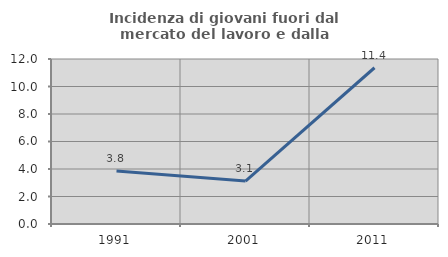
| Category | Incidenza di giovani fuori dal mercato del lavoro e dalla formazione  |
|---|---|
| 1991.0 | 3.846 |
| 2001.0 | 3.125 |
| 2011.0 | 11.364 |